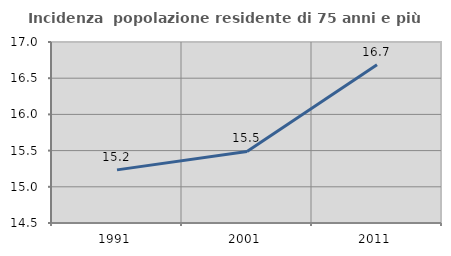
| Category | Incidenza  popolazione residente di 75 anni e più |
|---|---|
| 1991.0 | 15.234 |
| 2001.0 | 15.488 |
| 2011.0 | 16.685 |